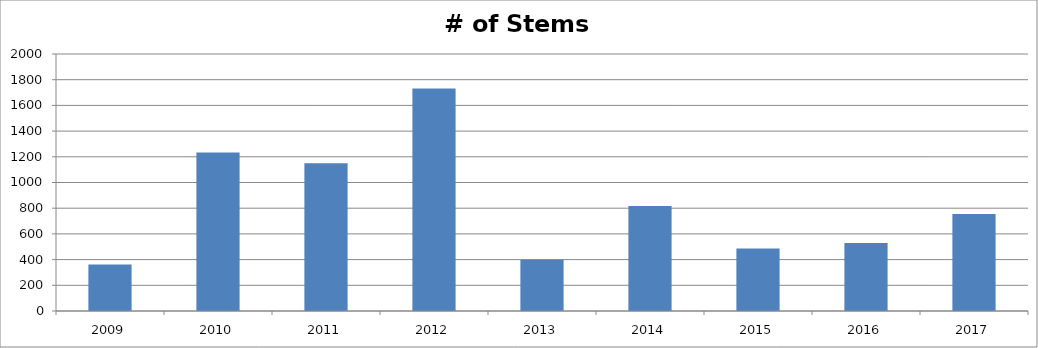
| Category | # of Stems Observed |
|---|---|
| 2009.0 | 361 |
| 2010.0 | 1234 |
| 2011.0 | 1149 |
| 2012.0 | 1732 |
| 2013.0 | 399 |
| 2014.0 | 817 |
| 2015.0 | 487 |
| 2016.0 | 529 |
| 2017.0 | 755 |